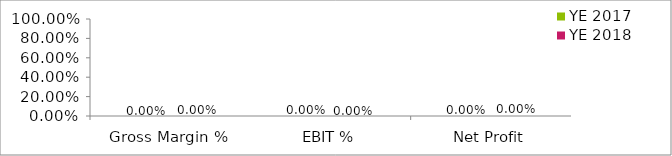
| Category | YE 2017 | YE 2018 |
|---|---|---|
| Gross Margin % | 0 | 0 |
| EBIT % | 0 | 0 |
| Net Profit | 0 | 0 |